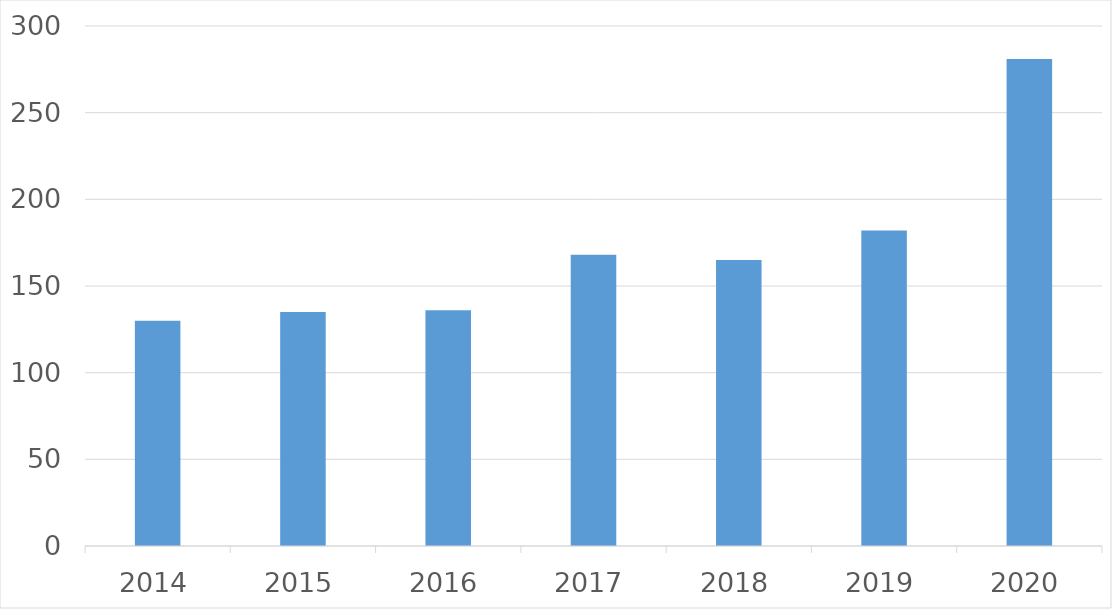
| Category | Series 0 |
|---|---|
| 2014 | 130 |
| 2015 | 135 |
| 2016 | 136 |
| 2017 | 168 |
| 2018 | 165 |
| 2019 | 182 |
| 2020 | 281 |